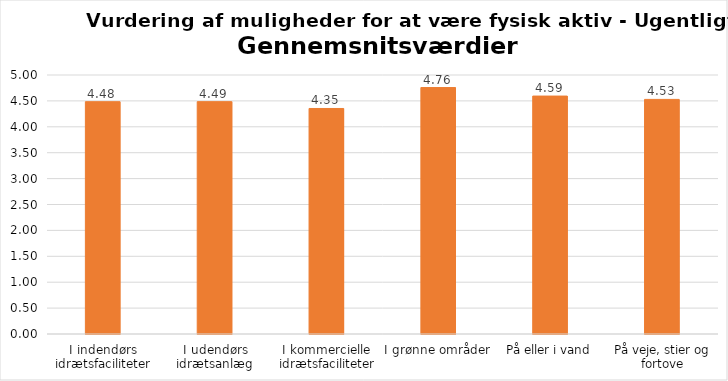
| Category | Gennemsnit |
|---|---|
| I indendørs idrætsfaciliteter | 4.485 |
| I udendørs idrætsanlæg | 4.485 |
| I kommercielle idrætsfaciliteter | 4.354 |
| I grønne områder | 4.758 |
| På eller i vand | 4.593 |
| På veje, stier og fortove | 4.529 |